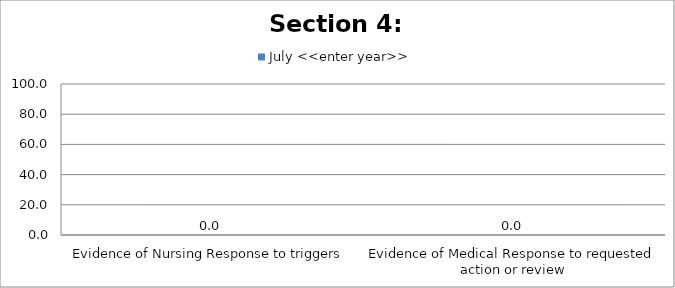
| Category | July <<enter year>> |
|---|---|
| Evidence of Nursing Response to triggers | 0 |
| Evidence of Medical Response to requested action or review | 0 |